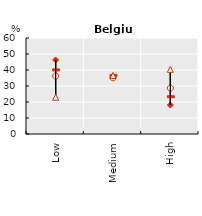
| Category | Series 0 | Series 1 | Series 2 | Series 3 |
|---|---|---|---|---|
| Low | 46.286 | 36.204 | 40.053 | 22.986 |
| Medium | 35.603 | 35.116 | 36.642 | 36.573 |
| High | 18.111 | 28.68 | 23.304 | 40.441 |